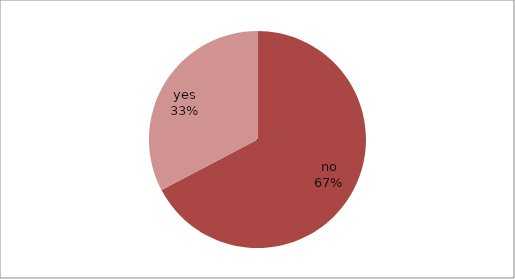
| Category | Series 0 |
|---|---|
| no | 72 |
| yes | 35 |